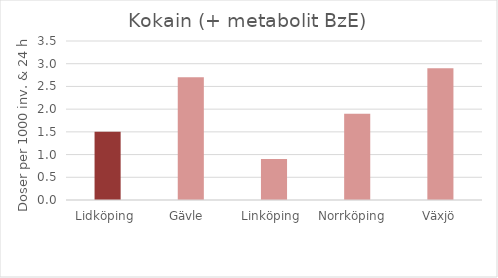
| Category | Kokain (+ metabolit BzE) |
|---|---|
| Lidköping  | 1.5 |
| Gävle  | 2.7 |
| Linköping  | 0.9 |
| Norrköping   | 1.9 |
| Växjö | 2.9 |